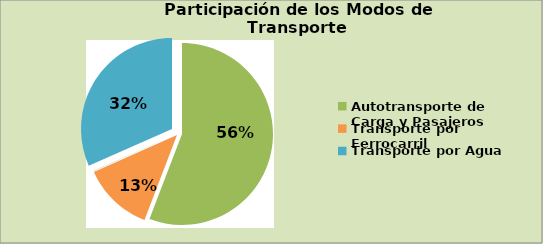
| Category | Series 0 |
|---|---|
| Autotransporte de Carga y Pasajeros | 498147 |
| Transporte por Ferrocarril | 111607 |
| Transporte Aéreo | 554 |
| Transporte por Agua | 282126 |